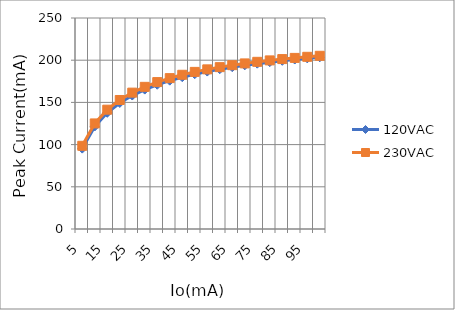
| Category | 120VAC | 230VAC |
|---|---|---|
| 5.0 | 95.24 | 98.567 |
| 10.0 | 121.448 | 125.086 |
| 15.0 | 137.717 | 141.367 |
| 20.0 | 149.299 | 152.86 |
| 25.0 | 158.131 | 161.563 |
| 30.0 | 165.159 | 168.449 |
| 35.0 | 170.921 | 174.066 |
| 40.0 | 175.749 | 178.752 |
| 45.0 | 179.865 | 182.732 |
| 50.0 | 183.423 | 186.16 |
| 55.0 | 186.533 | 189.147 |
| 60.0 | 189.278 | 191.776 |
| 65.0 | 191.721 | 194.109 |
| 70.0 | 193.91 | 196.195 |
| 75.0 | 195.884 | 198.073 |
| 80.0 | 197.674 | 199.772 |
| 85.0 | 199.306 | 201.317 |
| 90.0 | 200.799 | 202.729 |
| 95.0 | 202.171 | 204.024 |
| 100.0 | 203.437 | 205.218 |